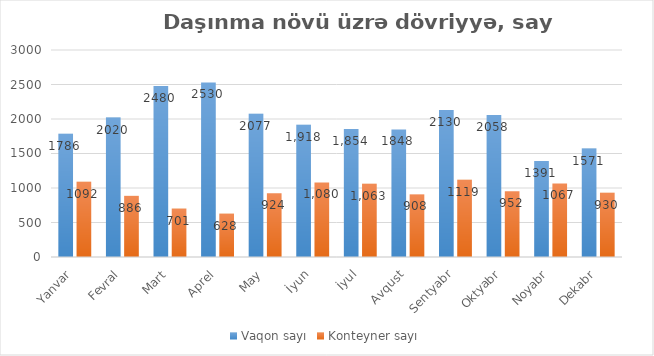
| Category | Vaqon sayı | Konteyner sayı |
|---|---|---|
| Yanvar | 1786 | 1092 |
| Fevral | 2020 | 886 |
| Mart | 2480 | 701 |
| Aprel | 2530 | 628 |
| May | 2077 | 924 |
| İyun | 1918 | 1080 |
| İyul | 1854 | 1063 |
| Avqust | 1848 | 908 |
| Sentyabr | 2130 | 1119 |
| Oktyabr | 2058 | 952 |
| Noyabr | 1391 | 1067 |
| Dekabr | 1571 | 930 |